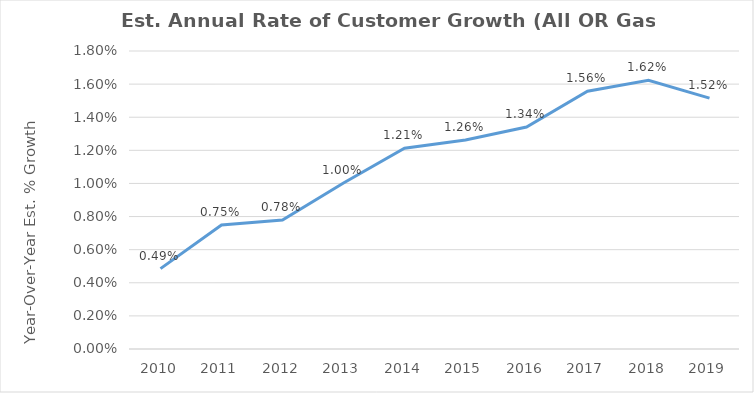
| Category | Year-Over-Year % Growth |
|---|---|
| 2010.0 | 0.005 |
| 2011.0 | 0.007 |
| 2012.0 | 0.008 |
| 2013.0 | 0.01 |
| 2014.0 | 0.012 |
| 2015.0 | 0.013 |
| 2016.0 | 0.013 |
| 2017.0 | 0.016 |
| 2018.0 | 0.016 |
| 2019.0 | 0.015 |